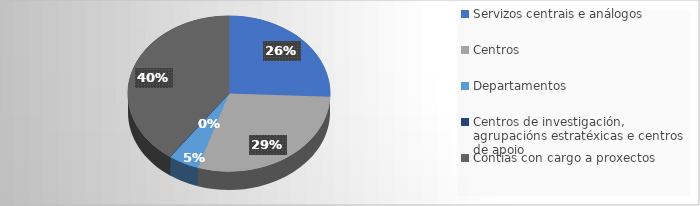
| Category | Series 0 |
|---|---|
| Servizos centrais e análogos | 17621.57 |
| Centros | 20174.15 |
| Departamentos | 3350.16 |
| Centros de investigación, agrupacións estratéxicas e centros de apoio | 48.26 |
| Contías con cargo a proxectos | 27572.97 |